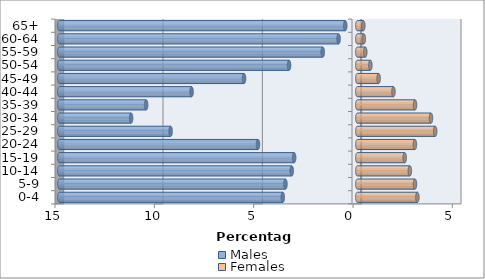
| Category | Males | Females |
|---|---|---|
| 0-4 | -3.752 | 3.022 |
| 5-9 | -3.619 | 2.902 |
| 10-14 | -3.302 | 2.644 |
| 15-19 | -3.18 | 2.385 |
| 20-24 | -5.001 | 2.898 |
| 25-29 | -9.399 | 3.918 |
| 30-34 | -11.387 | 3.707 |
| 35-39 | -10.631 | 2.905 |
| 40-44 | -8.344 | 1.818 |
| 45-49 | -5.704 | 1.072 |
| 50-54 | -3.436 | 0.656 |
| 55-59 | -1.741 | 0.399 |
| 60-64 | -0.943 | 0.325 |
| 65+ | -0.609 | 0.302 |